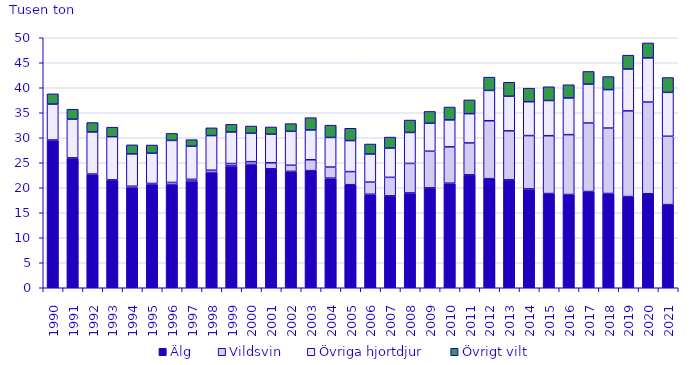
| Category | Älg | Vildsvin | Övriga hjortdjur | Övrigt vilt |
|---|---|---|---|---|
| 1990.0 | 29.516 | 0.038 | 7.172 | 2.058 |
| 1991.0 | 25.913 | 0.066 | 7.734 | 1.995 |
| 1992.0 | 22.67 | 0.073 | 8.416 | 1.885 |
| 1993.0 | 21.398 | 0.178 | 8.637 | 1.903 |
| 1994.0 | 20.117 | 0.187 | 6.471 | 1.808 |
| 1995.0 | 20.688 | 0.173 | 6.051 | 1.637 |
| 1996.0 | 20.644 | 0.419 | 8.402 | 1.405 |
| 1997.0 | 21.34 | 0.347 | 6.62 | 1.314 |
| 1998.0 | 23.061 | 0.451 | 6.923 | 1.547 |
| 1999.0 | 24.364 | 0.477 | 6.306 | 1.536 |
| 2000.0 | 24.676 | 0.539 | 5.693 | 1.438 |
| 2001.0 | 23.79 | 1.198 | 5.726 | 1.445 |
| 2002.0 | 23.278 | 1.222 | 6.787 | 1.542 |
| 2003.0 | 23.423 | 2.179 | 5.962 | 2.453 |
| 2004.0 | 21.92 | 2.218 | 5.919 | 2.465 |
| 2005.0 | 20.615 | 2.614 | 6.205 | 2.465 |
| 2006.0 | 18.698 | 2.428 | 5.626 | 1.999 |
| 2007.0 | 18.381 | 3.698 | 5.85 | 2.204 |
| 2008.0 | 18.967 | 5.9 | 6.192 | 2.482 |
| 2009.0 | 19.979 | 7.326 | 5.59 | 2.37 |
| 2010.0 | 20.914 | 7.262 | 5.399 | 2.577 |
| 2011.0 | 22.585 | 6.376 | 5.856 | 2.758 |
| 2012.0 | 21.822 | 11.579 | 6.066 | 2.663 |
| 2013.0 | 21.582 | 9.798 | 6.925 | 2.79 |
| 2014.0 | 19.77 | 10.662 | 6.773 | 2.712 |
| 2015.0 | 18.84 | 11.568 | 7.04 | 2.755 |
| 2016.0 | 18.641 | 11.983 | 7.332 | 2.647 |
| 2017.0 | 19.242 | 13.706 | 7.777 | 2.539 |
| 2018.0 | 18.854 | 13.08 | 7.693 | 2.612 |
| 2019.0 | 18.24 | 17.135 | 8.365 | 2.778 |
| 2020.0 | 18.802 | 18.342 | 8.824 | 3.001 |
| 2021.0 | 16.624 | 13.677 | 8.776 | 2.965 |